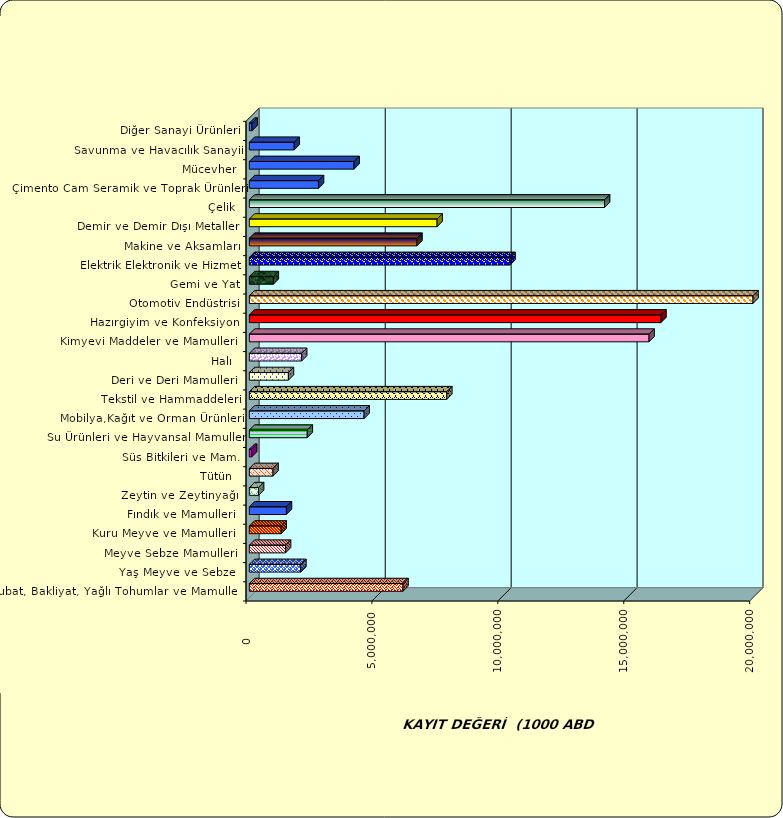
| Category | Series 0 |
|---|---|
|  Hububat, Bakliyat, Yağlı Tohumlar ve Mamulleri  | 6101511.392 |
|  Yaş Meyve ve Sebze   | 2044921.082 |
|  Meyve Sebze Mamulleri  | 1437005.624 |
|  Kuru Meyve ve Mamulleri   | 1262745.576 |
|  Fındık ve Mamulleri  | 1472480.84 |
|  Zeytin ve Zeytinyağı  | 366587.075 |
|  Tütün  | 939693.475 |
|  Süs Bitkileri ve Mam. | 91969.374 |
|  Su Ürünleri ve Hayvansal Mamuller | 2300361.81 |
|  Mobilya,Kağıt ve Orman Ürünleri | 4557231.29 |
|  Tekstil ve Hammaddeleri | 7840609.198 |
|  Deri ve Deri Mamulleri  | 1550966.517 |
|  Halı  | 2076222.577 |
|  Kimyevi Maddeler ve Mamulleri   | 15871820.303 |
|  Hazırgiyim ve Konfeksiyon  | 16343401.21 |
|  Otomotiv Endüstrisi | 29097657.472 |
|  Gemi ve Yat | 951952.809 |
|  Elektrik Elektronik ve Hizmet | 10352186.17 |
|  Makine ve Aksamları | 6654725.138 |
|  Demir ve Demir Dışı Metaller  | 7454760.622 |
|  Çelik | 14105889.752 |
|  Çimento Cam Seramik ve Toprak Ürünleri | 2745719.343 |
|  Mücevher | 4159211.171 |
|  Savunma ve Havacılık Sanayii | 1782053.874 |
|  Diğer Sanayi Ürünleri | 108260.618 |